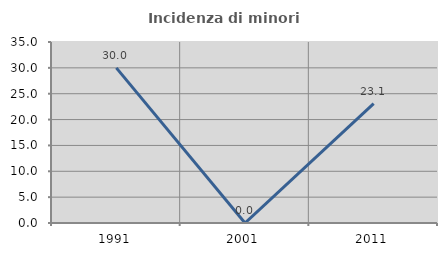
| Category | Incidenza di minori stranieri |
|---|---|
| 1991.0 | 30 |
| 2001.0 | 0 |
| 2011.0 | 23.077 |